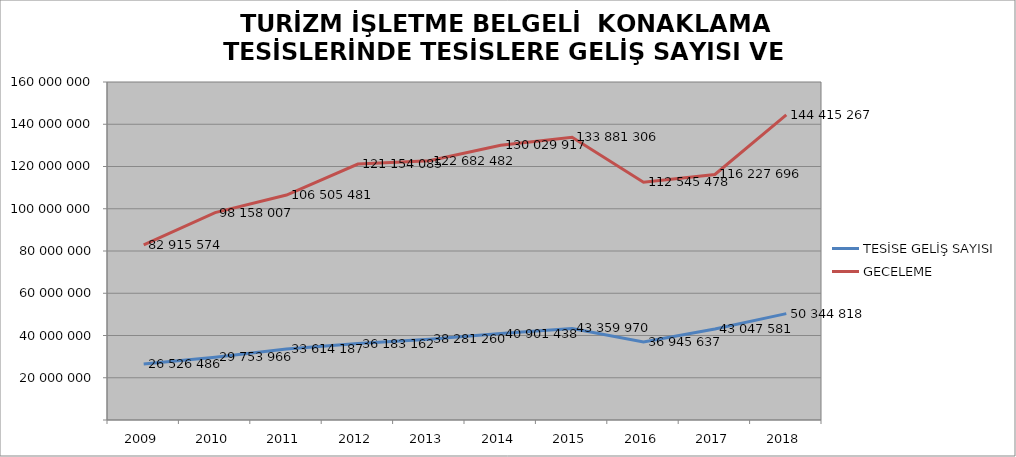
| Category | TESİSE GELİŞ SAYISI | GECELEME |
|---|---|---|
| 2009 | 26526486 | 82915574 |
| 2010 | 29753966 | 98158007 |
| 2011 | 33614187 | 106505481 |
| 2012 | 36183162 | 121154085 |
| 2013 | 38281260 | 122682482 |
| 2014 | 40901438 | 130029917 |
| 2015 | 43359970 | 133881306 |
| 2016 | 36945637 | 112545478 |
| 2017 | 43047581 | 116227696 |
| 2018 | 50344818 | 144415267 |